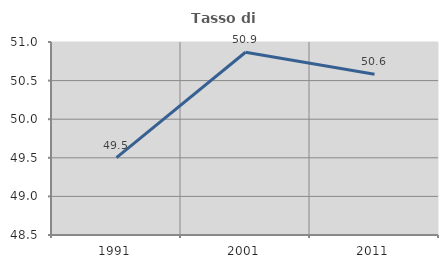
| Category | Tasso di occupazione   |
|---|---|
| 1991.0 | 49.502 |
| 2001.0 | 50.867 |
| 2011.0 | 50.582 |